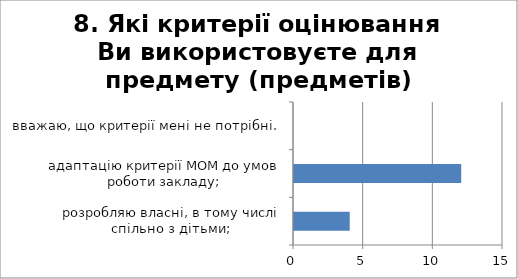
| Category | 8. Які критерії оцінювання Ви використовуєте для предмету (предметів) викладаєте? |
|---|---|
| розробляю власні, в тому числі спільно з дітьми; | 4 |
| адаптацію критерії МОМ до умов роботи закладу; | 12 |
| вважаю, що критерії мені не потрібні. | 0 |